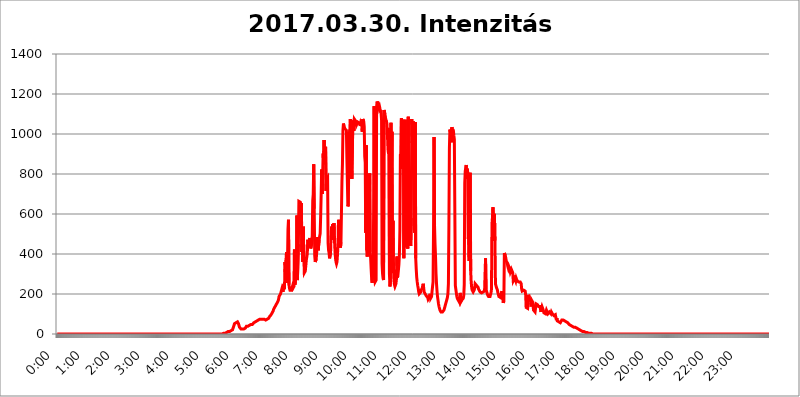
| Category | 2017.03.30. Intenzitás [W/m^2] |
|---|---|
| 0.0 | 0 |
| 0.0006944444444444445 | 0 |
| 0.001388888888888889 | 0 |
| 0.0020833333333333333 | 0 |
| 0.002777777777777778 | 0 |
| 0.003472222222222222 | 0 |
| 0.004166666666666667 | 0 |
| 0.004861111111111111 | 0 |
| 0.005555555555555556 | 0 |
| 0.0062499999999999995 | 0 |
| 0.006944444444444444 | 0 |
| 0.007638888888888889 | 0 |
| 0.008333333333333333 | 0 |
| 0.009027777777777779 | 0 |
| 0.009722222222222222 | 0 |
| 0.010416666666666666 | 0 |
| 0.011111111111111112 | 0 |
| 0.011805555555555555 | 0 |
| 0.012499999999999999 | 0 |
| 0.013194444444444444 | 0 |
| 0.013888888888888888 | 0 |
| 0.014583333333333332 | 0 |
| 0.015277777777777777 | 0 |
| 0.015972222222222224 | 0 |
| 0.016666666666666666 | 0 |
| 0.017361111111111112 | 0 |
| 0.018055555555555557 | 0 |
| 0.01875 | 0 |
| 0.019444444444444445 | 0 |
| 0.02013888888888889 | 0 |
| 0.020833333333333332 | 0 |
| 0.02152777777777778 | 0 |
| 0.022222222222222223 | 0 |
| 0.02291666666666667 | 0 |
| 0.02361111111111111 | 0 |
| 0.024305555555555556 | 0 |
| 0.024999999999999998 | 0 |
| 0.025694444444444447 | 0 |
| 0.02638888888888889 | 0 |
| 0.027083333333333334 | 0 |
| 0.027777777777777776 | 0 |
| 0.02847222222222222 | 0 |
| 0.029166666666666664 | 0 |
| 0.029861111111111113 | 0 |
| 0.030555555555555555 | 0 |
| 0.03125 | 0 |
| 0.03194444444444445 | 0 |
| 0.03263888888888889 | 0 |
| 0.03333333333333333 | 0 |
| 0.034027777777777775 | 0 |
| 0.034722222222222224 | 0 |
| 0.035416666666666666 | 0 |
| 0.036111111111111115 | 0 |
| 0.03680555555555556 | 0 |
| 0.0375 | 0 |
| 0.03819444444444444 | 0 |
| 0.03888888888888889 | 0 |
| 0.03958333333333333 | 0 |
| 0.04027777777777778 | 0 |
| 0.04097222222222222 | 0 |
| 0.041666666666666664 | 0 |
| 0.042361111111111106 | 0 |
| 0.04305555555555556 | 0 |
| 0.043750000000000004 | 0 |
| 0.044444444444444446 | 0 |
| 0.04513888888888889 | 0 |
| 0.04583333333333334 | 0 |
| 0.04652777777777778 | 0 |
| 0.04722222222222222 | 0 |
| 0.04791666666666666 | 0 |
| 0.04861111111111111 | 0 |
| 0.049305555555555554 | 0 |
| 0.049999999999999996 | 0 |
| 0.05069444444444445 | 0 |
| 0.051388888888888894 | 0 |
| 0.052083333333333336 | 0 |
| 0.05277777777777778 | 0 |
| 0.05347222222222222 | 0 |
| 0.05416666666666667 | 0 |
| 0.05486111111111111 | 0 |
| 0.05555555555555555 | 0 |
| 0.05625 | 0 |
| 0.05694444444444444 | 0 |
| 0.057638888888888885 | 0 |
| 0.05833333333333333 | 0 |
| 0.05902777777777778 | 0 |
| 0.059722222222222225 | 0 |
| 0.06041666666666667 | 0 |
| 0.061111111111111116 | 0 |
| 0.06180555555555556 | 0 |
| 0.0625 | 0 |
| 0.06319444444444444 | 0 |
| 0.06388888888888888 | 0 |
| 0.06458333333333334 | 0 |
| 0.06527777777777778 | 0 |
| 0.06597222222222222 | 0 |
| 0.06666666666666667 | 0 |
| 0.06736111111111111 | 0 |
| 0.06805555555555555 | 0 |
| 0.06874999999999999 | 0 |
| 0.06944444444444443 | 0 |
| 0.07013888888888889 | 0 |
| 0.07083333333333333 | 0 |
| 0.07152777777777779 | 0 |
| 0.07222222222222223 | 0 |
| 0.07291666666666667 | 0 |
| 0.07361111111111111 | 0 |
| 0.07430555555555556 | 0 |
| 0.075 | 0 |
| 0.07569444444444444 | 0 |
| 0.0763888888888889 | 0 |
| 0.07708333333333334 | 0 |
| 0.07777777777777778 | 0 |
| 0.07847222222222222 | 0 |
| 0.07916666666666666 | 0 |
| 0.0798611111111111 | 0 |
| 0.08055555555555556 | 0 |
| 0.08125 | 0 |
| 0.08194444444444444 | 0 |
| 0.08263888888888889 | 0 |
| 0.08333333333333333 | 0 |
| 0.08402777777777777 | 0 |
| 0.08472222222222221 | 0 |
| 0.08541666666666665 | 0 |
| 0.08611111111111112 | 0 |
| 0.08680555555555557 | 0 |
| 0.08750000000000001 | 0 |
| 0.08819444444444445 | 0 |
| 0.08888888888888889 | 0 |
| 0.08958333333333333 | 0 |
| 0.09027777777777778 | 0 |
| 0.09097222222222222 | 0 |
| 0.09166666666666667 | 0 |
| 0.09236111111111112 | 0 |
| 0.09305555555555556 | 0 |
| 0.09375 | 0 |
| 0.09444444444444444 | 0 |
| 0.09513888888888888 | 0 |
| 0.09583333333333333 | 0 |
| 0.09652777777777777 | 0 |
| 0.09722222222222222 | 0 |
| 0.09791666666666667 | 0 |
| 0.09861111111111111 | 0 |
| 0.09930555555555555 | 0 |
| 0.09999999999999999 | 0 |
| 0.10069444444444443 | 0 |
| 0.1013888888888889 | 0 |
| 0.10208333333333335 | 0 |
| 0.10277777777777779 | 0 |
| 0.10347222222222223 | 0 |
| 0.10416666666666667 | 0 |
| 0.10486111111111111 | 0 |
| 0.10555555555555556 | 0 |
| 0.10625 | 0 |
| 0.10694444444444444 | 0 |
| 0.1076388888888889 | 0 |
| 0.10833333333333334 | 0 |
| 0.10902777777777778 | 0 |
| 0.10972222222222222 | 0 |
| 0.1111111111111111 | 0 |
| 0.11180555555555556 | 0 |
| 0.11180555555555556 | 0 |
| 0.1125 | 0 |
| 0.11319444444444444 | 0 |
| 0.11388888888888889 | 0 |
| 0.11458333333333333 | 0 |
| 0.11527777777777777 | 0 |
| 0.11597222222222221 | 0 |
| 0.11666666666666665 | 0 |
| 0.1173611111111111 | 0 |
| 0.11805555555555557 | 0 |
| 0.11944444444444445 | 0 |
| 0.12013888888888889 | 0 |
| 0.12083333333333333 | 0 |
| 0.12152777777777778 | 0 |
| 0.12222222222222223 | 0 |
| 0.12291666666666667 | 0 |
| 0.12291666666666667 | 0 |
| 0.12361111111111112 | 0 |
| 0.12430555555555556 | 0 |
| 0.125 | 0 |
| 0.12569444444444444 | 0 |
| 0.12638888888888888 | 0 |
| 0.12708333333333333 | 0 |
| 0.16875 | 0 |
| 0.12847222222222224 | 0 |
| 0.12916666666666668 | 0 |
| 0.12986111111111112 | 0 |
| 0.13055555555555556 | 0 |
| 0.13125 | 0 |
| 0.13194444444444445 | 0 |
| 0.1326388888888889 | 0 |
| 0.13333333333333333 | 0 |
| 0.13402777777777777 | 0 |
| 0.13402777777777777 | 0 |
| 0.13472222222222222 | 0 |
| 0.13541666666666666 | 0 |
| 0.1361111111111111 | 0 |
| 0.13749999999999998 | 0 |
| 0.13819444444444443 | 0 |
| 0.1388888888888889 | 0 |
| 0.13958333333333334 | 0 |
| 0.14027777777777778 | 0 |
| 0.14097222222222222 | 0 |
| 0.14166666666666666 | 0 |
| 0.1423611111111111 | 0 |
| 0.14305555555555557 | 0 |
| 0.14375000000000002 | 0 |
| 0.14444444444444446 | 0 |
| 0.1451388888888889 | 0 |
| 0.1451388888888889 | 0 |
| 0.14652777777777778 | 0 |
| 0.14722222222222223 | 0 |
| 0.14791666666666667 | 0 |
| 0.1486111111111111 | 0 |
| 0.14930555555555555 | 0 |
| 0.15 | 0 |
| 0.15069444444444444 | 0 |
| 0.15138888888888888 | 0 |
| 0.15208333333333332 | 0 |
| 0.15277777777777776 | 0 |
| 0.15347222222222223 | 0 |
| 0.15416666666666667 | 0 |
| 0.15486111111111112 | 0 |
| 0.15555555555555556 | 0 |
| 0.15625 | 0 |
| 0.15694444444444444 | 0 |
| 0.15763888888888888 | 0 |
| 0.15833333333333333 | 0 |
| 0.15902777777777777 | 0 |
| 0.15972222222222224 | 0 |
| 0.16041666666666668 | 0 |
| 0.16111111111111112 | 0 |
| 0.16180555555555556 | 0 |
| 0.1625 | 0 |
| 0.16319444444444445 | 0 |
| 0.1638888888888889 | 0 |
| 0.16458333333333333 | 0 |
| 0.16527777777777777 | 0 |
| 0.16597222222222222 | 0 |
| 0.16666666666666666 | 0 |
| 0.1673611111111111 | 0 |
| 0.16805555555555554 | 0 |
| 0.16874999999999998 | 0 |
| 0.16944444444444443 | 0 |
| 0.17013888888888887 | 0 |
| 0.1708333333333333 | 0 |
| 0.17152777777777775 | 0 |
| 0.17222222222222225 | 0 |
| 0.1729166666666667 | 0 |
| 0.17361111111111113 | 0 |
| 0.17430555555555557 | 0 |
| 0.17500000000000002 | 0 |
| 0.17569444444444446 | 0 |
| 0.1763888888888889 | 0 |
| 0.17708333333333334 | 0 |
| 0.17777777777777778 | 0 |
| 0.17847222222222223 | 0 |
| 0.17916666666666667 | 0 |
| 0.1798611111111111 | 0 |
| 0.18055555555555555 | 0 |
| 0.18125 | 0 |
| 0.18194444444444444 | 0 |
| 0.1826388888888889 | 0 |
| 0.18333333333333335 | 0 |
| 0.1840277777777778 | 0 |
| 0.18472222222222223 | 0 |
| 0.18541666666666667 | 0 |
| 0.18611111111111112 | 0 |
| 0.18680555555555556 | 0 |
| 0.1875 | 0 |
| 0.18819444444444444 | 0 |
| 0.18888888888888888 | 0 |
| 0.18958333333333333 | 0 |
| 0.19027777777777777 | 0 |
| 0.1909722222222222 | 0 |
| 0.19166666666666665 | 0 |
| 0.19236111111111112 | 0 |
| 0.19305555555555554 | 0 |
| 0.19375 | 0 |
| 0.19444444444444445 | 0 |
| 0.1951388888888889 | 0 |
| 0.19583333333333333 | 0 |
| 0.19652777777777777 | 0 |
| 0.19722222222222222 | 0 |
| 0.19791666666666666 | 0 |
| 0.1986111111111111 | 0 |
| 0.19930555555555554 | 0 |
| 0.19999999999999998 | 0 |
| 0.20069444444444443 | 0 |
| 0.20138888888888887 | 0 |
| 0.2020833333333333 | 0 |
| 0.2027777777777778 | 0 |
| 0.2034722222222222 | 0 |
| 0.2041666666666667 | 0 |
| 0.20486111111111113 | 0 |
| 0.20555555555555557 | 0 |
| 0.20625000000000002 | 0 |
| 0.20694444444444446 | 0 |
| 0.2076388888888889 | 0 |
| 0.20833333333333334 | 0 |
| 0.20902777777777778 | 0 |
| 0.20972222222222223 | 0 |
| 0.21041666666666667 | 0 |
| 0.2111111111111111 | 0 |
| 0.21180555555555555 | 0 |
| 0.2125 | 0 |
| 0.21319444444444444 | 0 |
| 0.2138888888888889 | 0 |
| 0.21458333333333335 | 0 |
| 0.2152777777777778 | 0 |
| 0.21597222222222223 | 0 |
| 0.21666666666666667 | 0 |
| 0.21736111111111112 | 0 |
| 0.21805555555555556 | 0 |
| 0.21875 | 0 |
| 0.21944444444444444 | 0 |
| 0.22013888888888888 | 0 |
| 0.22083333333333333 | 0 |
| 0.22152777777777777 | 0 |
| 0.2222222222222222 | 0 |
| 0.22291666666666665 | 0 |
| 0.2236111111111111 | 0 |
| 0.22430555555555556 | 0 |
| 0.225 | 0 |
| 0.22569444444444445 | 0 |
| 0.2263888888888889 | 0 |
| 0.22708333333333333 | 0 |
| 0.22777777777777777 | 0 |
| 0.22847222222222222 | 0 |
| 0.22916666666666666 | 0 |
| 0.2298611111111111 | 0 |
| 0.23055555555555554 | 0 |
| 0.23124999999999998 | 0 |
| 0.23194444444444443 | 0 |
| 0.23263888888888887 | 3.525 |
| 0.2333333333333333 | 3.525 |
| 0.2340277777777778 | 3.525 |
| 0.2347222222222222 | 3.525 |
| 0.2354166666666667 | 3.525 |
| 0.23611111111111113 | 3.525 |
| 0.23680555555555557 | 3.525 |
| 0.23750000000000002 | 7.887 |
| 0.23819444444444446 | 7.887 |
| 0.2388888888888889 | 7.887 |
| 0.23958333333333334 | 12.257 |
| 0.24027777777777778 | 12.257 |
| 0.24097222222222223 | 12.257 |
| 0.24166666666666667 | 12.257 |
| 0.2423611111111111 | 12.257 |
| 0.24305555555555555 | 12.257 |
| 0.24375 | 16.636 |
| 0.24444444444444446 | 16.636 |
| 0.24513888888888888 | 16.636 |
| 0.24583333333333335 | 21.024 |
| 0.2465277777777778 | 21.024 |
| 0.24722222222222223 | 25.419 |
| 0.24791666666666667 | 43.079 |
| 0.24861111111111112 | 51.951 |
| 0.24930555555555556 | 51.951 |
| 0.25 | 56.398 |
| 0.25069444444444444 | 56.398 |
| 0.2513888888888889 | 56.398 |
| 0.2520833333333333 | 56.398 |
| 0.25277777777777777 | 60.85 |
| 0.2534722222222222 | 56.398 |
| 0.25416666666666665 | 51.951 |
| 0.2548611111111111 | 51.951 |
| 0.2555555555555556 | 34.234 |
| 0.25625000000000003 | 29.823 |
| 0.2569444444444445 | 34.234 |
| 0.2576388888888889 | 25.419 |
| 0.25833333333333336 | 25.419 |
| 0.2590277777777778 | 25.419 |
| 0.25972222222222224 | 25.419 |
| 0.2604166666666667 | 25.419 |
| 0.2611111111111111 | 25.419 |
| 0.26180555555555557 | 25.419 |
| 0.2625 | 29.823 |
| 0.26319444444444445 | 29.823 |
| 0.2638888888888889 | 29.823 |
| 0.26458333333333334 | 34.234 |
| 0.2652777777777778 | 38.653 |
| 0.2659722222222222 | 38.653 |
| 0.26666666666666666 | 38.653 |
| 0.2673611111111111 | 38.653 |
| 0.26805555555555555 | 38.653 |
| 0.26875 | 43.079 |
| 0.26944444444444443 | 43.079 |
| 0.2701388888888889 | 43.079 |
| 0.2708333333333333 | 47.511 |
| 0.27152777777777776 | 47.511 |
| 0.2722222222222222 | 47.511 |
| 0.27291666666666664 | 47.511 |
| 0.2736111111111111 | 47.511 |
| 0.2743055555555555 | 47.511 |
| 0.27499999999999997 | 51.951 |
| 0.27569444444444446 | 56.398 |
| 0.27638888888888885 | 56.398 |
| 0.27708333333333335 | 56.398 |
| 0.2777777777777778 | 60.85 |
| 0.27847222222222223 | 60.85 |
| 0.2791666666666667 | 60.85 |
| 0.2798611111111111 | 65.31 |
| 0.28055555555555556 | 65.31 |
| 0.28125 | 65.31 |
| 0.28194444444444444 | 69.775 |
| 0.2826388888888889 | 69.775 |
| 0.2833333333333333 | 74.246 |
| 0.28402777777777777 | 74.246 |
| 0.2847222222222222 | 74.246 |
| 0.28541666666666665 | 74.246 |
| 0.28611111111111115 | 74.246 |
| 0.28680555555555554 | 74.246 |
| 0.28750000000000003 | 74.246 |
| 0.2881944444444445 | 74.246 |
| 0.2888888888888889 | 74.246 |
| 0.28958333333333336 | 74.246 |
| 0.2902777777777778 | 74.246 |
| 0.29097222222222224 | 69.775 |
| 0.2916666666666667 | 69.775 |
| 0.2923611111111111 | 69.775 |
| 0.29305555555555557 | 74.246 |
| 0.29375 | 74.246 |
| 0.29444444444444445 | 74.246 |
| 0.2951388888888889 | 74.246 |
| 0.29583333333333334 | 74.246 |
| 0.2965277777777778 | 78.722 |
| 0.2972222222222222 | 83.205 |
| 0.29791666666666666 | 87.692 |
| 0.2986111111111111 | 92.184 |
| 0.29930555555555555 | 92.184 |
| 0.3 | 96.682 |
| 0.30069444444444443 | 101.184 |
| 0.3013888888888889 | 105.69 |
| 0.3020833333333333 | 110.201 |
| 0.30277777777777776 | 114.716 |
| 0.3034722222222222 | 123.758 |
| 0.30416666666666664 | 128.284 |
| 0.3048611111111111 | 132.814 |
| 0.3055555555555555 | 137.347 |
| 0.30624999999999997 | 137.347 |
| 0.3069444444444444 | 146.423 |
| 0.3076388888888889 | 146.423 |
| 0.30833333333333335 | 155.509 |
| 0.3090277777777778 | 160.056 |
| 0.30972222222222223 | 164.605 |
| 0.3104166666666667 | 173.709 |
| 0.3111111111111111 | 187.378 |
| 0.31180555555555556 | 187.378 |
| 0.3125 | 191.937 |
| 0.31319444444444444 | 201.058 |
| 0.3138888888888889 | 210.182 |
| 0.3145833333333333 | 210.182 |
| 0.31527777777777777 | 228.436 |
| 0.3159722222222222 | 223.873 |
| 0.31666666666666665 | 210.182 |
| 0.31736111111111115 | 246.689 |
| 0.31805555555555554 | 223.873 |
| 0.31875000000000003 | 233 |
| 0.3194444444444445 | 360.221 |
| 0.3201388888888889 | 292.259 |
| 0.32083333333333336 | 369.23 |
| 0.3215277777777778 | 409.574 |
| 0.32222222222222224 | 255.813 |
| 0.3229166666666667 | 355.712 |
| 0.3236111111111111 | 523.88 |
| 0.32430555555555557 | 571.049 |
| 0.325 | 246.689 |
| 0.32569444444444445 | 228.436 |
| 0.3263888888888889 | 219.309 |
| 0.32708333333333334 | 219.309 |
| 0.3277777777777778 | 219.309 |
| 0.3284722222222222 | 219.309 |
| 0.32916666666666666 | 219.309 |
| 0.3298611111111111 | 237.564 |
| 0.33055555555555555 | 228.436 |
| 0.33125 | 233 |
| 0.33194444444444443 | 237.564 |
| 0.3326388888888889 | 422.943 |
| 0.3333333333333333 | 246.689 |
| 0.3340277777777778 | 251.251 |
| 0.3347222222222222 | 287.709 |
| 0.3354166666666667 | 324.052 |
| 0.3361111111111111 | 592.233 |
| 0.3368055555555556 | 269.49 |
| 0.33749999999999997 | 269.49 |
| 0.33819444444444446 | 449.551 |
| 0.33888888888888885 | 663.019 |
| 0.33958333333333335 | 658.909 |
| 0.34027777777777773 | 658.909 |
| 0.34097222222222223 | 658.909 |
| 0.3416666666666666 | 646.537 |
| 0.3423611111111111 | 654.791 |
| 0.3430555555555555 | 409.574 |
| 0.34375 | 475.972 |
| 0.3444444444444445 | 360.221 |
| 0.3451388888888889 | 536.82 |
| 0.3458333333333334 | 387.202 |
| 0.34652777777777777 | 305.898 |
| 0.34722222222222227 | 301.354 |
| 0.34791666666666665 | 314.98 |
| 0.34861111111111115 | 342.162 |
| 0.34930555555555554 | 369.23 |
| 0.35000000000000003 | 369.23 |
| 0.3506944444444444 | 400.638 |
| 0.3513888888888889 | 471.582 |
| 0.3520833333333333 | 440.702 |
| 0.3527777777777778 | 436.27 |
| 0.3534722222222222 | 458.38 |
| 0.3541666666666667 | 480.356 |
| 0.3548611111111111 | 449.551 |
| 0.35555555555555557 | 427.39 |
| 0.35625 | 422.943 |
| 0.35694444444444445 | 453.968 |
| 0.3576388888888889 | 493.475 |
| 0.35833333333333334 | 667.123 |
| 0.3590277777777778 | 699.717 |
| 0.3597222222222222 | 849.199 |
| 0.36041666666666666 | 625.784 |
| 0.3611111111111111 | 391.685 |
| 0.36180555555555555 | 360.221 |
| 0.3625 | 360.221 |
| 0.36319444444444443 | 373.729 |
| 0.3638888888888889 | 409.574 |
| 0.3645833333333333 | 462.786 |
| 0.3652777777777778 | 484.735 |
| 0.3659722222222222 | 418.492 |
| 0.3666666666666667 | 422.943 |
| 0.3673611111111111 | 471.582 |
| 0.3680555555555556 | 489.108 |
| 0.36874999999999997 | 502.192 |
| 0.36944444444444446 | 588.009 |
| 0.37013888888888885 | 695.666 |
| 0.37083333333333335 | 822.26 |
| 0.37152777777777773 | 699.717 |
| 0.37222222222222223 | 791.169 |
| 0.3729166666666666 | 902.447 |
| 0.3736111111111111 | 860.676 |
| 0.3743055555555555 | 970.034 |
| 0.375 | 849.199 |
| 0.3756944444444445 | 887.309 |
| 0.3763888888888889 | 936.33 |
| 0.3770833333333334 | 715.858 |
| 0.37777777777777777 | 775.492 |
| 0.37847222222222227 | 779.42 |
| 0.37916666666666665 | 783.342 |
| 0.37986111111111115 | 453.968 |
| 0.38055555555555554 | 418.492 |
| 0.38125000000000003 | 405.108 |
| 0.3819444444444444 | 378.224 |
| 0.3826388888888889 | 378.224 |
| 0.3833333333333333 | 405.108 |
| 0.3840277777777778 | 484.735 |
| 0.3847222222222222 | 536.82 |
| 0.3854166666666667 | 471.582 |
| 0.3861111111111111 | 549.704 |
| 0.38680555555555557 | 541.121 |
| 0.3875 | 532.513 |
| 0.38819444444444445 | 553.986 |
| 0.3888888888888889 | 462.786 |
| 0.38958333333333334 | 414.035 |
| 0.3902777777777778 | 378.224 |
| 0.3909722222222222 | 360.221 |
| 0.39166666666666666 | 351.198 |
| 0.3923611111111111 | 360.221 |
| 0.39305555555555555 | 396.164 |
| 0.39375 | 445.129 |
| 0.39444444444444443 | 571.049 |
| 0.3951388888888889 | 566.793 |
| 0.3958333333333333 | 519.555 |
| 0.3965277777777778 | 562.53 |
| 0.3972222222222222 | 431.833 |
| 0.3979166666666667 | 458.38 |
| 0.3986111111111111 | 609.062 |
| 0.3993055555555556 | 763.674 |
| 0.39999999999999997 | 849.199 |
| 0.40069444444444446 | 1018.587 |
| 0.40138888888888885 | 1052.255 |
| 0.40208333333333335 | 1041.019 |
| 0.40277777777777773 | 1037.277 |
| 0.40347222222222223 | 1026.06 |
| 0.4041666666666666 | 1022.323 |
| 0.4048611111111111 | 1022.323 |
| 0.4055555555555555 | 1018.587 |
| 0.40625 | 872.114 |
| 0.4069444444444445 | 875.918 |
| 0.4076388888888889 | 638.256 |
| 0.4083333333333334 | 646.537 |
| 0.40902777777777777 | 1011.118 |
| 0.40972222222222227 | 925.06 |
| 0.41041666666666665 | 1022.323 |
| 0.41111111111111115 | 1074.789 |
| 0.41180555555555554 | 787.258 |
| 0.41250000000000003 | 864.493 |
| 0.4131944444444444 | 775.492 |
| 0.4138888888888889 | 771.559 |
| 0.4145833333333333 | 1067.267 |
| 0.4152777777777778 | 1071.027 |
| 0.4159722222222222 | 1014.852 |
| 0.4166666666666667 | 1074.789 |
| 0.4173611111111111 | 1074.789 |
| 0.41805555555555557 | 1067.267 |
| 0.41875 | 1059.756 |
| 0.41944444444444445 | 1067.267 |
| 0.4201388888888889 | 1048.508 |
| 0.42083333333333334 | 1052.255 |
| 0.4215277777777778 | 1059.756 |
| 0.4222222222222222 | 1056.004 |
| 0.42291666666666666 | 1059.756 |
| 0.4236111111111111 | 1056.004 |
| 0.42430555555555555 | 1056.004 |
| 0.425 | 1041.019 |
| 0.42569444444444443 | 1056.004 |
| 0.4263888888888889 | 1052.255 |
| 0.4270833333333333 | 1044.762 |
| 0.4277777777777778 | 1011.118 |
| 0.4284722222222222 | 1074.789 |
| 0.4291666666666667 | 1071.027 |
| 0.4298611111111111 | 1063.51 |
| 0.4305555555555556 | 1037.277 |
| 0.43124999999999997 | 887.309 |
| 0.43194444444444446 | 856.855 |
| 0.43263888888888885 | 506.542 |
| 0.43333333333333335 | 943.832 |
| 0.43402777777777773 | 418.492 |
| 0.43472222222222223 | 387.202 |
| 0.4354166666666666 | 387.202 |
| 0.4361111111111111 | 436.27 |
| 0.4368055555555555 | 629.948 |
| 0.4375 | 493.475 |
| 0.4381944444444445 | 802.868 |
| 0.4388888888888889 | 414.035 |
| 0.4395833333333334 | 378.224 |
| 0.44027777777777777 | 324.052 |
| 0.44097222222222227 | 274.047 |
| 0.44166666666666665 | 255.813 |
| 0.44236111111111115 | 301.354 |
| 0.44305555555555554 | 319.517 |
| 0.44375000000000003 | 625.784 |
| 0.4444444444444444 | 1139.384 |
| 0.4451388888888889 | 287.709 |
| 0.4458333333333333 | 260.373 |
| 0.4465277777777778 | 264.932 |
| 0.4472222222222222 | 269.49 |
| 0.4479166666666667 | 1135.543 |
| 0.4486111111111111 | 1162.571 |
| 0.44930555555555557 | 1162.571 |
| 0.45 | 1150.946 |
| 0.45069444444444445 | 1139.384 |
| 0.4513888888888889 | 1127.879 |
| 0.45208333333333334 | 1135.543 |
| 0.4527777777777778 | 1124.056 |
| 0.4534722222222222 | 1120.238 |
| 0.45416666666666666 | 1105.019 |
| 0.4548611111111111 | 1071.027 |
| 0.45555555555555555 | 351.198 |
| 0.45625 | 301.354 |
| 0.45694444444444443 | 278.603 |
| 0.4576388888888889 | 269.49 |
| 0.4583333333333333 | 1120.238 |
| 0.4590277777777778 | 1108.816 |
| 0.4597222222222222 | 1101.226 |
| 0.4604166666666667 | 1059.756 |
| 0.4611111111111111 | 1071.027 |
| 0.4618055555555556 | 1063.51 |
| 0.46249999999999997 | 1048.508 |
| 0.46319444444444446 | 1044.762 |
| 0.46388888888888885 | 925.06 |
| 0.46458333333333335 | 902.447 |
| 0.46527777777777773 | 1029.798 |
| 0.46597222222222223 | 292.259 |
| 0.4666666666666666 | 237.564 |
| 0.4673611111111111 | 269.49 |
| 0.4680555555555555 | 1056.004 |
| 0.46875 | 806.757 |
| 0.4694444444444445 | 1011.118 |
| 0.4701388888888889 | 355.712 |
| 0.4708333333333334 | 566.793 |
| 0.47152777777777777 | 324.052 |
| 0.47222222222222227 | 269.49 |
| 0.47291666666666665 | 246.689 |
| 0.47361111111111115 | 237.564 |
| 0.47430555555555554 | 237.564 |
| 0.47500000000000003 | 251.251 |
| 0.4756944444444444 | 274.047 |
| 0.4763888888888889 | 387.202 |
| 0.4770833333333333 | 283.156 |
| 0.4777777777777778 | 292.259 |
| 0.4784722222222222 | 319.517 |
| 0.4791666666666667 | 346.682 |
| 0.4798611111111111 | 396.164 |
| 0.48055555555555557 | 519.555 |
| 0.48125 | 898.668 |
| 0.48194444444444445 | 826.123 |
| 0.4826388888888889 | 1078.555 |
| 0.48333333333333334 | 1078.555 |
| 0.4840277777777778 | 1059.756 |
| 0.4847222222222222 | 1071.027 |
| 0.48541666666666666 | 1056.004 |
| 0.4861111111111111 | 378.224 |
| 0.48680555555555555 | 1063.51 |
| 0.4875 | 872.114 |
| 0.48819444444444443 | 1071.027 |
| 0.4888888888888889 | 583.779 |
| 0.4895833333333333 | 449.551 |
| 0.4902777777777778 | 431.833 |
| 0.4909722222222222 | 440.702 |
| 0.4916666666666667 | 427.39 |
| 0.4923611111111111 | 1086.097 |
| 0.4930555555555556 | 549.704 |
| 0.49374999999999997 | 650.667 |
| 0.49444444444444446 | 471.582 |
| 0.49513888888888885 | 458.38 |
| 0.49583333333333335 | 440.702 |
| 0.49652777777777773 | 579.542 |
| 0.49722222222222223 | 1074.789 |
| 0.4979166666666666 | 955.071 |
| 0.4986111111111111 | 992.448 |
| 0.4993055555555555 | 1063.51 |
| 0.5 | 1041.019 |
| 0.5006944444444444 | 523.88 |
| 0.5013888888888889 | 506.542 |
| 0.5020833333333333 | 1059.756 |
| 0.5027777777777778 | 378.224 |
| 0.5034722222222222 | 324.052 |
| 0.5041666666666667 | 283.156 |
| 0.5048611111111111 | 260.373 |
| 0.5055555555555555 | 242.127 |
| 0.50625 | 228.436 |
| 0.5069444444444444 | 210.182 |
| 0.5076388888888889 | 201.058 |
| 0.5083333333333333 | 196.497 |
| 0.5090277777777777 | 205.62 |
| 0.5097222222222222 | 210.182 |
| 0.5104166666666666 | 219.309 |
| 0.5111111111111112 | 219.309 |
| 0.5118055555555555 | 228.436 |
| 0.5125000000000001 | 237.564 |
| 0.5131944444444444 | 251.251 |
| 0.513888888888889 | 233 |
| 0.5145833333333333 | 210.182 |
| 0.5152777777777778 | 205.62 |
| 0.5159722222222222 | 201.058 |
| 0.5166666666666667 | 201.058 |
| 0.517361111111111 | 191.937 |
| 0.5180555555555556 | 191.937 |
| 0.5187499999999999 | 187.378 |
| 0.5194444444444445 | 182.82 |
| 0.5201388888888888 | 173.709 |
| 0.5208333333333334 | 173.709 |
| 0.5215277777777778 | 182.82 |
| 0.5222222222222223 | 191.937 |
| 0.5229166666666667 | 201.058 |
| 0.5236111111111111 | 178.264 |
| 0.5243055555555556 | 178.264 |
| 0.525 | 187.378 |
| 0.5256944444444445 | 214.746 |
| 0.5263888888888889 | 237.564 |
| 0.5270833333333333 | 260.373 |
| 0.5277777777777778 | 532.513 |
| 0.5284722222222222 | 984.98 |
| 0.5291666666666667 | 541.121 |
| 0.5298611111111111 | 449.551 |
| 0.5305555555555556 | 387.202 |
| 0.53125 | 301.354 |
| 0.5319444444444444 | 251.251 |
| 0.5326388888888889 | 214.746 |
| 0.5333333333333333 | 187.378 |
| 0.5340277777777778 | 169.156 |
| 0.5347222222222222 | 150.964 |
| 0.5354166666666667 | 137.347 |
| 0.5361111111111111 | 128.284 |
| 0.5368055555555555 | 119.235 |
| 0.5375 | 114.716 |
| 0.5381944444444444 | 110.201 |
| 0.5388888888888889 | 110.201 |
| 0.5395833333333333 | 110.201 |
| 0.5402777777777777 | 110.201 |
| 0.5409722222222222 | 114.716 |
| 0.5416666666666666 | 114.716 |
| 0.5423611111111112 | 119.235 |
| 0.5430555555555555 | 128.284 |
| 0.5437500000000001 | 137.347 |
| 0.5444444444444444 | 146.423 |
| 0.545138888888889 | 155.509 |
| 0.5458333333333333 | 164.605 |
| 0.5465277777777778 | 173.709 |
| 0.5472222222222222 | 182.82 |
| 0.5479166666666667 | 201.058 |
| 0.548611111111111 | 251.251 |
| 0.5493055555555556 | 545.416 |
| 0.5499999999999999 | 928.819 |
| 0.5506944444444445 | 1022.323 |
| 0.5513888888888888 | 1011.118 |
| 0.5520833333333334 | 1018.587 |
| 0.5527777777777778 | 958.814 |
| 0.5534722222222223 | 1033.537 |
| 0.5541666666666667 | 1026.06 |
| 0.5548611111111111 | 1022.323 |
| 0.5555555555555556 | 1018.587 |
| 0.55625 | 992.448 |
| 0.5569444444444445 | 973.772 |
| 0.5576388888888889 | 970.034 |
| 0.5583333333333333 | 242.127 |
| 0.5590277777777778 | 223.873 |
| 0.5597222222222222 | 205.62 |
| 0.5604166666666667 | 187.378 |
| 0.5611111111111111 | 178.264 |
| 0.5618055555555556 | 173.709 |
| 0.5625 | 169.156 |
| 0.5631944444444444 | 164.605 |
| 0.5638888888888889 | 160.056 |
| 0.5645833333333333 | 164.605 |
| 0.5652777777777778 | 205.62 |
| 0.5659722222222222 | 160.056 |
| 0.5666666666666667 | 160.056 |
| 0.5673611111111111 | 169.156 |
| 0.5680555555555555 | 164.605 |
| 0.56875 | 173.709 |
| 0.5694444444444444 | 178.264 |
| 0.5701388888888889 | 191.937 |
| 0.5708333333333333 | 246.689 |
| 0.5715277777777777 | 755.766 |
| 0.5722222222222222 | 814.519 |
| 0.5729166666666666 | 818.392 |
| 0.5736111111111112 | 845.365 |
| 0.5743055555555555 | 775.492 |
| 0.5750000000000001 | 826.123 |
| 0.5756944444444444 | 806.757 |
| 0.576388888888889 | 475.972 |
| 0.5770833333333333 | 489.108 |
| 0.5777777777777778 | 364.728 |
| 0.5784722222222222 | 787.258 |
| 0.5791666666666667 | 806.757 |
| 0.579861111111111 | 314.98 |
| 0.5805555555555556 | 260.373 |
| 0.5812499999999999 | 233 |
| 0.5819444444444445 | 219.309 |
| 0.5826388888888888 | 214.746 |
| 0.5833333333333334 | 210.182 |
| 0.5840277777777778 | 210.182 |
| 0.5847222222222223 | 219.309 |
| 0.5854166666666667 | 228.436 |
| 0.5861111111111111 | 251.251 |
| 0.5868055555555556 | 251.251 |
| 0.5875 | 246.689 |
| 0.5881944444444445 | 242.127 |
| 0.5888888888888889 | 246.689 |
| 0.5895833333333333 | 242.127 |
| 0.5902777777777778 | 233 |
| 0.5909722222222222 | 223.873 |
| 0.5916666666666667 | 219.309 |
| 0.5923611111111111 | 219.309 |
| 0.5930555555555556 | 210.182 |
| 0.59375 | 205.62 |
| 0.5944444444444444 | 205.62 |
| 0.5951388888888889 | 205.62 |
| 0.5958333333333333 | 205.62 |
| 0.5965277777777778 | 210.182 |
| 0.5972222222222222 | 210.182 |
| 0.5979166666666667 | 214.746 |
| 0.5986111111111111 | 214.746 |
| 0.5993055555555555 | 214.746 |
| 0.6 | 219.309 |
| 0.6006944444444444 | 378.224 |
| 0.6013888888888889 | 223.873 |
| 0.6020833333333333 | 214.746 |
| 0.6027777777777777 | 205.62 |
| 0.6034722222222222 | 196.497 |
| 0.6041666666666666 | 191.937 |
| 0.6048611111111112 | 187.378 |
| 0.6055555555555555 | 182.82 |
| 0.6062500000000001 | 182.82 |
| 0.6069444444444444 | 187.378 |
| 0.607638888888889 | 196.497 |
| 0.6083333333333333 | 205.62 |
| 0.6090277777777778 | 223.873 |
| 0.6097222222222222 | 549.704 |
| 0.6104166666666667 | 583.779 |
| 0.611111111111111 | 634.105 |
| 0.6118055555555556 | 629.948 |
| 0.6124999999999999 | 467.187 |
| 0.6131944444444445 | 600.661 |
| 0.6138888888888888 | 467.187 |
| 0.6145833333333334 | 251.251 |
| 0.6152777777777778 | 242.127 |
| 0.6159722222222223 | 233 |
| 0.6166666666666667 | 228.436 |
| 0.6173611111111111 | 219.309 |
| 0.6180555555555556 | 205.62 |
| 0.61875 | 196.497 |
| 0.6194444444444445 | 187.378 |
| 0.6201388888888889 | 182.82 |
| 0.6208333333333333 | 182.82 |
| 0.6215277777777778 | 182.82 |
| 0.6222222222222222 | 182.82 |
| 0.6229166666666667 | 182.82 |
| 0.6236111111111111 | 214.746 |
| 0.6243055555555556 | 173.709 |
| 0.625 | 210.182 |
| 0.6256944444444444 | 155.509 |
| 0.6263888888888889 | 164.605 |
| 0.6270833333333333 | 405.108 |
| 0.6277777777777778 | 405.108 |
| 0.6284722222222222 | 391.685 |
| 0.6291666666666667 | 378.224 |
| 0.6298611111111111 | 364.728 |
| 0.6305555555555555 | 364.728 |
| 0.63125 | 351.198 |
| 0.6319444444444444 | 337.639 |
| 0.6326388888888889 | 328.584 |
| 0.6333333333333333 | 337.639 |
| 0.6340277777777777 | 333.113 |
| 0.6347222222222222 | 324.052 |
| 0.6354166666666666 | 310.44 |
| 0.6361111111111112 | 305.898 |
| 0.6368055555555555 | 324.052 |
| 0.6375000000000001 | 324.052 |
| 0.6381944444444444 | 328.584 |
| 0.638888888888889 | 305.898 |
| 0.6395833333333333 | 264.932 |
| 0.6402777777777778 | 269.49 |
| 0.6409722222222222 | 269.49 |
| 0.6416666666666667 | 278.603 |
| 0.642361111111111 | 278.603 |
| 0.6430555555555556 | 264.932 |
| 0.6437499999999999 | 278.603 |
| 0.6444444444444445 | 278.603 |
| 0.6451388888888888 | 264.932 |
| 0.6458333333333334 | 264.932 |
| 0.6465277777777778 | 260.373 |
| 0.6472222222222223 | 260.373 |
| 0.6479166666666667 | 260.373 |
| 0.6486111111111111 | 260.373 |
| 0.6493055555555556 | 260.373 |
| 0.65 | 260.373 |
| 0.6506944444444445 | 251.251 |
| 0.6513888888888889 | 223.873 |
| 0.6520833333333333 | 214.746 |
| 0.6527777777777778 | 219.309 |
| 0.6534722222222222 | 219.309 |
| 0.6541666666666667 | 219.309 |
| 0.6548611111111111 | 223.873 |
| 0.6555555555555556 | 214.746 |
| 0.65625 | 214.746 |
| 0.6569444444444444 | 196.497 |
| 0.6576388888888889 | 132.814 |
| 0.6583333333333333 | 128.284 |
| 0.6590277777777778 | 128.284 |
| 0.6597222222222222 | 128.284 |
| 0.6604166666666667 | 128.284 |
| 0.6611111111111111 | 196.497 |
| 0.6618055555555555 | 182.82 |
| 0.6625 | 169.156 |
| 0.6631944444444444 | 178.264 |
| 0.6638888888888889 | 164.605 |
| 0.6645833333333333 | 137.347 |
| 0.6652777777777777 | 169.156 |
| 0.6659722222222222 | 164.605 |
| 0.6666666666666666 | 160.056 |
| 0.6673611111111111 | 164.605 |
| 0.6680555555555556 | 119.235 |
| 0.6687500000000001 | 123.758 |
| 0.6694444444444444 | 114.716 |
| 0.6701388888888888 | 110.201 |
| 0.6708333333333334 | 114.716 |
| 0.6715277777777778 | 150.964 |
| 0.6722222222222222 | 155.509 |
| 0.6729166666666666 | 150.964 |
| 0.6736111111111112 | 146.423 |
| 0.6743055555555556 | 141.884 |
| 0.6749999999999999 | 137.347 |
| 0.6756944444444444 | 137.347 |
| 0.6763888888888889 | 137.347 |
| 0.6770833333333334 | 137.347 |
| 0.6777777777777777 | 123.758 |
| 0.6784722222222223 | 110.201 |
| 0.6791666666666667 | 128.284 |
| 0.6798611111111111 | 137.347 |
| 0.6805555555555555 | 132.814 |
| 0.68125 | 123.758 |
| 0.6819444444444445 | 119.235 |
| 0.6826388888888889 | 105.69 |
| 0.6833333333333332 | 110.201 |
| 0.6840277777777778 | 105.69 |
| 0.6847222222222222 | 101.184 |
| 0.6854166666666667 | 110.201 |
| 0.686111111111111 | 119.235 |
| 0.6868055555555556 | 119.235 |
| 0.6875 | 123.758 |
| 0.6881944444444444 | 101.184 |
| 0.688888888888889 | 105.69 |
| 0.6895833333333333 | 101.184 |
| 0.6902777777777778 | 110.201 |
| 0.6909722222222222 | 110.201 |
| 0.6916666666666668 | 114.716 |
| 0.6923611111111111 | 101.184 |
| 0.6930555555555555 | 110.201 |
| 0.69375 | 110.201 |
| 0.6944444444444445 | 101.184 |
| 0.6951388888888889 | 105.69 |
| 0.6958333333333333 | 101.184 |
| 0.6965277777777777 | 92.184 |
| 0.6972222222222223 | 96.682 |
| 0.6979166666666666 | 96.682 |
| 0.6986111111111111 | 96.682 |
| 0.6993055555555556 | 92.184 |
| 0.7000000000000001 | 69.775 |
| 0.7006944444444444 | 78.722 |
| 0.7013888888888888 | 65.31 |
| 0.7020833333333334 | 60.85 |
| 0.7027777777777778 | 60.85 |
| 0.7034722222222222 | 60.85 |
| 0.7041666666666666 | 56.398 |
| 0.7048611111111112 | 56.398 |
| 0.7055555555555556 | 56.398 |
| 0.7062499999999999 | 56.398 |
| 0.7069444444444444 | 60.85 |
| 0.7076388888888889 | 69.775 |
| 0.7083333333333334 | 74.246 |
| 0.7090277777777777 | 69.775 |
| 0.7097222222222223 | 69.775 |
| 0.7104166666666667 | 69.775 |
| 0.7111111111111111 | 69.775 |
| 0.7118055555555555 | 65.31 |
| 0.7125 | 65.31 |
| 0.7131944444444445 | 60.85 |
| 0.7138888888888889 | 60.85 |
| 0.7145833333333332 | 60.85 |
| 0.7152777777777778 | 56.398 |
| 0.7159722222222222 | 56.398 |
| 0.7166666666666667 | 51.951 |
| 0.717361111111111 | 51.951 |
| 0.7180555555555556 | 47.511 |
| 0.71875 | 47.511 |
| 0.7194444444444444 | 43.079 |
| 0.720138888888889 | 43.079 |
| 0.7208333333333333 | 43.079 |
| 0.7215277777777778 | 38.653 |
| 0.7222222222222222 | 38.653 |
| 0.7229166666666668 | 38.653 |
| 0.7236111111111111 | 38.653 |
| 0.7243055555555555 | 34.234 |
| 0.725 | 34.234 |
| 0.7256944444444445 | 34.234 |
| 0.7263888888888889 | 34.234 |
| 0.7270833333333333 | 29.823 |
| 0.7277777777777777 | 29.823 |
| 0.7284722222222223 | 29.823 |
| 0.7291666666666666 | 25.419 |
| 0.7298611111111111 | 25.419 |
| 0.7305555555555556 | 25.419 |
| 0.7312500000000001 | 21.024 |
| 0.7319444444444444 | 21.024 |
| 0.7326388888888888 | 21.024 |
| 0.7333333333333334 | 21.024 |
| 0.7340277777777778 | 16.636 |
| 0.7347222222222222 | 16.636 |
| 0.7354166666666666 | 12.257 |
| 0.7361111111111112 | 12.257 |
| 0.7368055555555556 | 12.257 |
| 0.7374999999999999 | 12.257 |
| 0.7381944444444444 | 12.257 |
| 0.7388888888888889 | 12.257 |
| 0.7395833333333334 | 12.257 |
| 0.7402777777777777 | 7.887 |
| 0.7409722222222223 | 7.887 |
| 0.7416666666666667 | 7.887 |
| 0.7423611111111111 | 7.887 |
| 0.7430555555555555 | 7.887 |
| 0.74375 | 7.887 |
| 0.7444444444444445 | 3.525 |
| 0.7451388888888889 | 3.525 |
| 0.7458333333333332 | 3.525 |
| 0.7465277777777778 | 3.525 |
| 0.7472222222222222 | 3.525 |
| 0.7479166666666667 | 3.525 |
| 0.748611111111111 | 3.525 |
| 0.7493055555555556 | 3.525 |
| 0.75 | 3.525 |
| 0.7506944444444444 | 3.525 |
| 0.751388888888889 | 0 |
| 0.7520833333333333 | 0 |
| 0.7527777777777778 | 0 |
| 0.7534722222222222 | 0 |
| 0.7541666666666668 | 0 |
| 0.7548611111111111 | 0 |
| 0.7555555555555555 | 0 |
| 0.75625 | 0 |
| 0.7569444444444445 | 0 |
| 0.7576388888888889 | 0 |
| 0.7583333333333333 | 0 |
| 0.7590277777777777 | 0 |
| 0.7597222222222223 | 0 |
| 0.7604166666666666 | 0 |
| 0.7611111111111111 | 0 |
| 0.7618055555555556 | 0 |
| 0.7625000000000001 | 0 |
| 0.7631944444444444 | 0 |
| 0.7638888888888888 | 0 |
| 0.7645833333333334 | 0 |
| 0.7652777777777778 | 0 |
| 0.7659722222222222 | 0 |
| 0.7666666666666666 | 0 |
| 0.7673611111111112 | 0 |
| 0.7680555555555556 | 0 |
| 0.7687499999999999 | 0 |
| 0.7694444444444444 | 0 |
| 0.7701388888888889 | 0 |
| 0.7708333333333334 | 0 |
| 0.7715277777777777 | 0 |
| 0.7722222222222223 | 0 |
| 0.7729166666666667 | 0 |
| 0.7736111111111111 | 0 |
| 0.7743055555555555 | 0 |
| 0.775 | 0 |
| 0.7756944444444445 | 0 |
| 0.7763888888888889 | 0 |
| 0.7770833333333332 | 0 |
| 0.7777777777777778 | 0 |
| 0.7784722222222222 | 0 |
| 0.7791666666666667 | 0 |
| 0.779861111111111 | 0 |
| 0.7805555555555556 | 0 |
| 0.78125 | 0 |
| 0.7819444444444444 | 0 |
| 0.782638888888889 | 0 |
| 0.7833333333333333 | 0 |
| 0.7840277777777778 | 0 |
| 0.7847222222222222 | 0 |
| 0.7854166666666668 | 0 |
| 0.7861111111111111 | 0 |
| 0.7868055555555555 | 0 |
| 0.7875 | 0 |
| 0.7881944444444445 | 0 |
| 0.7888888888888889 | 0 |
| 0.7895833333333333 | 0 |
| 0.7902777777777777 | 0 |
| 0.7909722222222223 | 0 |
| 0.7916666666666666 | 0 |
| 0.7923611111111111 | 0 |
| 0.7930555555555556 | 0 |
| 0.7937500000000001 | 0 |
| 0.7944444444444444 | 0 |
| 0.7951388888888888 | 0 |
| 0.7958333333333334 | 0 |
| 0.7965277777777778 | 0 |
| 0.7972222222222222 | 0 |
| 0.7979166666666666 | 0 |
| 0.7986111111111112 | 0 |
| 0.7993055555555556 | 0 |
| 0.7999999999999999 | 0 |
| 0.8006944444444444 | 0 |
| 0.8013888888888889 | 0 |
| 0.8020833333333334 | 0 |
| 0.8027777777777777 | 0 |
| 0.8034722222222223 | 0 |
| 0.8041666666666667 | 0 |
| 0.8048611111111111 | 0 |
| 0.8055555555555555 | 0 |
| 0.80625 | 0 |
| 0.8069444444444445 | 0 |
| 0.8076388888888889 | 0 |
| 0.8083333333333332 | 0 |
| 0.8090277777777778 | 0 |
| 0.8097222222222222 | 0 |
| 0.8104166666666667 | 0 |
| 0.811111111111111 | 0 |
| 0.8118055555555556 | 0 |
| 0.8125 | 0 |
| 0.8131944444444444 | 0 |
| 0.813888888888889 | 0 |
| 0.8145833333333333 | 0 |
| 0.8152777777777778 | 0 |
| 0.8159722222222222 | 0 |
| 0.8166666666666668 | 0 |
| 0.8173611111111111 | 0 |
| 0.8180555555555555 | 0 |
| 0.81875 | 0 |
| 0.8194444444444445 | 0 |
| 0.8201388888888889 | 0 |
| 0.8208333333333333 | 0 |
| 0.8215277777777777 | 0 |
| 0.8222222222222223 | 0 |
| 0.8229166666666666 | 0 |
| 0.8236111111111111 | 0 |
| 0.8243055555555556 | 0 |
| 0.8250000000000001 | 0 |
| 0.8256944444444444 | 0 |
| 0.8263888888888888 | 0 |
| 0.8270833333333334 | 0 |
| 0.8277777777777778 | 0 |
| 0.8284722222222222 | 0 |
| 0.8291666666666666 | 0 |
| 0.8298611111111112 | 0 |
| 0.8305555555555556 | 0 |
| 0.8312499999999999 | 0 |
| 0.8319444444444444 | 0 |
| 0.8326388888888889 | 0 |
| 0.8333333333333334 | 0 |
| 0.8340277777777777 | 0 |
| 0.8347222222222223 | 0 |
| 0.8354166666666667 | 0 |
| 0.8361111111111111 | 0 |
| 0.8368055555555555 | 0 |
| 0.8375 | 0 |
| 0.8381944444444445 | 0 |
| 0.8388888888888889 | 0 |
| 0.8395833333333332 | 0 |
| 0.8402777777777778 | 0 |
| 0.8409722222222222 | 0 |
| 0.8416666666666667 | 0 |
| 0.842361111111111 | 0 |
| 0.8430555555555556 | 0 |
| 0.84375 | 0 |
| 0.8444444444444444 | 0 |
| 0.845138888888889 | 0 |
| 0.8458333333333333 | 0 |
| 0.8465277777777778 | 0 |
| 0.8472222222222222 | 0 |
| 0.8479166666666668 | 0 |
| 0.8486111111111111 | 0 |
| 0.8493055555555555 | 0 |
| 0.85 | 0 |
| 0.8506944444444445 | 0 |
| 0.8513888888888889 | 0 |
| 0.8520833333333333 | 0 |
| 0.8527777777777777 | 0 |
| 0.8534722222222223 | 0 |
| 0.8541666666666666 | 0 |
| 0.8548611111111111 | 0 |
| 0.8555555555555556 | 0 |
| 0.8562500000000001 | 0 |
| 0.8569444444444444 | 0 |
| 0.8576388888888888 | 0 |
| 0.8583333333333334 | 0 |
| 0.8590277777777778 | 0 |
| 0.8597222222222222 | 0 |
| 0.8604166666666666 | 0 |
| 0.8611111111111112 | 0 |
| 0.8618055555555556 | 0 |
| 0.8624999999999999 | 0 |
| 0.8631944444444444 | 0 |
| 0.8638888888888889 | 0 |
| 0.8645833333333334 | 0 |
| 0.8652777777777777 | 0 |
| 0.8659722222222223 | 0 |
| 0.8666666666666667 | 0 |
| 0.8673611111111111 | 0 |
| 0.8680555555555555 | 0 |
| 0.86875 | 0 |
| 0.8694444444444445 | 0 |
| 0.8701388888888889 | 0 |
| 0.8708333333333332 | 0 |
| 0.8715277777777778 | 0 |
| 0.8722222222222222 | 0 |
| 0.8729166666666667 | 0 |
| 0.873611111111111 | 0 |
| 0.8743055555555556 | 0 |
| 0.875 | 0 |
| 0.8756944444444444 | 0 |
| 0.876388888888889 | 0 |
| 0.8770833333333333 | 0 |
| 0.8777777777777778 | 0 |
| 0.8784722222222222 | 0 |
| 0.8791666666666668 | 0 |
| 0.8798611111111111 | 0 |
| 0.8805555555555555 | 0 |
| 0.88125 | 0 |
| 0.8819444444444445 | 0 |
| 0.8826388888888889 | 0 |
| 0.8833333333333333 | 0 |
| 0.8840277777777777 | 0 |
| 0.8847222222222223 | 0 |
| 0.8854166666666666 | 0 |
| 0.8861111111111111 | 0 |
| 0.8868055555555556 | 0 |
| 0.8875000000000001 | 0 |
| 0.8881944444444444 | 0 |
| 0.8888888888888888 | 0 |
| 0.8895833333333334 | 0 |
| 0.8902777777777778 | 0 |
| 0.8909722222222222 | 0 |
| 0.8916666666666666 | 0 |
| 0.8923611111111112 | 0 |
| 0.8930555555555556 | 0 |
| 0.8937499999999999 | 0 |
| 0.8944444444444444 | 0 |
| 0.8951388888888889 | 0 |
| 0.8958333333333334 | 0 |
| 0.8965277777777777 | 0 |
| 0.8972222222222223 | 0 |
| 0.8979166666666667 | 0 |
| 0.8986111111111111 | 0 |
| 0.8993055555555555 | 0 |
| 0.9 | 0 |
| 0.9006944444444445 | 0 |
| 0.9013888888888889 | 0 |
| 0.9020833333333332 | 0 |
| 0.9027777777777778 | 0 |
| 0.9034722222222222 | 0 |
| 0.9041666666666667 | 0 |
| 0.904861111111111 | 0 |
| 0.9055555555555556 | 0 |
| 0.90625 | 0 |
| 0.9069444444444444 | 0 |
| 0.907638888888889 | 0 |
| 0.9083333333333333 | 0 |
| 0.9090277777777778 | 0 |
| 0.9097222222222222 | 0 |
| 0.9104166666666668 | 0 |
| 0.9111111111111111 | 0 |
| 0.9118055555555555 | 0 |
| 0.9125 | 0 |
| 0.9131944444444445 | 0 |
| 0.9138888888888889 | 0 |
| 0.9145833333333333 | 0 |
| 0.9152777777777777 | 0 |
| 0.9159722222222223 | 0 |
| 0.9166666666666666 | 0 |
| 0.9173611111111111 | 0 |
| 0.9180555555555556 | 0 |
| 0.9187500000000001 | 0 |
| 0.9194444444444444 | 0 |
| 0.9201388888888888 | 0 |
| 0.9208333333333334 | 0 |
| 0.9215277777777778 | 0 |
| 0.9222222222222222 | 0 |
| 0.9229166666666666 | 0 |
| 0.9236111111111112 | 0 |
| 0.9243055555555556 | 0 |
| 0.9249999999999999 | 0 |
| 0.9256944444444444 | 0 |
| 0.9263888888888889 | 0 |
| 0.9270833333333334 | 0 |
| 0.9277777777777777 | 0 |
| 0.9284722222222223 | 0 |
| 0.9291666666666667 | 0 |
| 0.9298611111111111 | 0 |
| 0.9305555555555555 | 0 |
| 0.93125 | 0 |
| 0.9319444444444445 | 0 |
| 0.9326388888888889 | 0 |
| 0.9333333333333332 | 0 |
| 0.9340277777777778 | 0 |
| 0.9347222222222222 | 0 |
| 0.9354166666666667 | 0 |
| 0.936111111111111 | 0 |
| 0.9368055555555556 | 0 |
| 0.9375 | 0 |
| 0.9381944444444444 | 0 |
| 0.938888888888889 | 0 |
| 0.9395833333333333 | 0 |
| 0.9402777777777778 | 0 |
| 0.9409722222222222 | 0 |
| 0.9416666666666668 | 0 |
| 0.9423611111111111 | 0 |
| 0.9430555555555555 | 0 |
| 0.94375 | 0 |
| 0.9444444444444445 | 0 |
| 0.9451388888888889 | 0 |
| 0.9458333333333333 | 0 |
| 0.9465277777777777 | 0 |
| 0.9472222222222223 | 0 |
| 0.9479166666666666 | 0 |
| 0.9486111111111111 | 0 |
| 0.9493055555555556 | 0 |
| 0.9500000000000001 | 0 |
| 0.9506944444444444 | 0 |
| 0.9513888888888888 | 0 |
| 0.9520833333333334 | 0 |
| 0.9527777777777778 | 0 |
| 0.9534722222222222 | 0 |
| 0.9541666666666666 | 0 |
| 0.9548611111111112 | 0 |
| 0.9555555555555556 | 0 |
| 0.9562499999999999 | 0 |
| 0.9569444444444444 | 0 |
| 0.9576388888888889 | 0 |
| 0.9583333333333334 | 0 |
| 0.9590277777777777 | 0 |
| 0.9597222222222223 | 0 |
| 0.9604166666666667 | 0 |
| 0.9611111111111111 | 0 |
| 0.9618055555555555 | 0 |
| 0.9625 | 0 |
| 0.9631944444444445 | 0 |
| 0.9638888888888889 | 0 |
| 0.9645833333333332 | 0 |
| 0.9652777777777778 | 0 |
| 0.9659722222222222 | 0 |
| 0.9666666666666667 | 0 |
| 0.967361111111111 | 0 |
| 0.9680555555555556 | 0 |
| 0.96875 | 0 |
| 0.9694444444444444 | 0 |
| 0.970138888888889 | 0 |
| 0.9708333333333333 | 0 |
| 0.9715277777777778 | 0 |
| 0.9722222222222222 | 0 |
| 0.9729166666666668 | 0 |
| 0.9736111111111111 | 0 |
| 0.9743055555555555 | 0 |
| 0.975 | 0 |
| 0.9756944444444445 | 0 |
| 0.9763888888888889 | 0 |
| 0.9770833333333333 | 0 |
| 0.9777777777777777 | 0 |
| 0.9784722222222223 | 0 |
| 0.9791666666666666 | 0 |
| 0.9798611111111111 | 0 |
| 0.9805555555555556 | 0 |
| 0.9812500000000001 | 0 |
| 0.9819444444444444 | 0 |
| 0.9826388888888888 | 0 |
| 0.9833333333333334 | 0 |
| 0.9840277777777778 | 0 |
| 0.9847222222222222 | 0 |
| 0.9854166666666666 | 0 |
| 0.9861111111111112 | 0 |
| 0.9868055555555556 | 0 |
| 0.9874999999999999 | 0 |
| 0.9881944444444444 | 0 |
| 0.9888888888888889 | 0 |
| 0.9895833333333334 | 0 |
| 0.9902777777777777 | 0 |
| 0.9909722222222223 | 0 |
| 0.9916666666666667 | 0 |
| 0.9923611111111111 | 0 |
| 0.9930555555555555 | 0 |
| 0.99375 | 0 |
| 0.9944444444444445 | 0 |
| 0.9951388888888889 | 0 |
| 0.9958333333333332 | 0 |
| 0.9965277777777778 | 0 |
| 0.9972222222222222 | 0 |
| 0.9979166666666667 | 0 |
| 0.998611111111111 | 0 |
| 0.9993055555555556 | 0 |